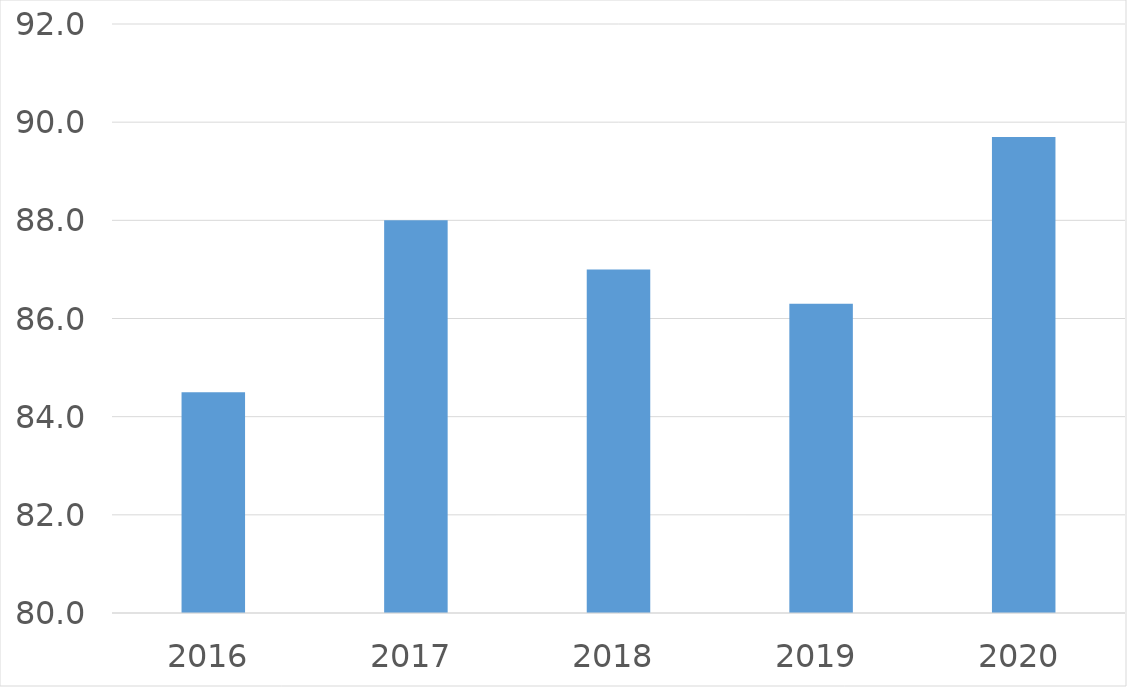
| Category | Series 0 |
|---|---|
| 2016 | 84.5 |
| 2017 | 88 |
| 2018 | 87 |
| 2019 | 86.3 |
| 2020 | 89.7 |